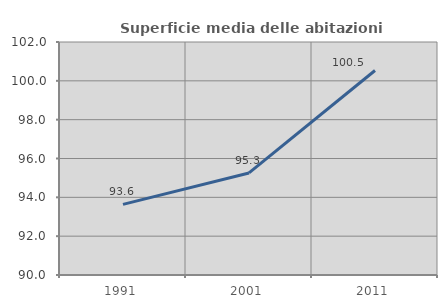
| Category | Superficie media delle abitazioni occupate |
|---|---|
| 1991.0 | 93.636 |
| 2001.0 | 95.257 |
| 2011.0 | 100.531 |